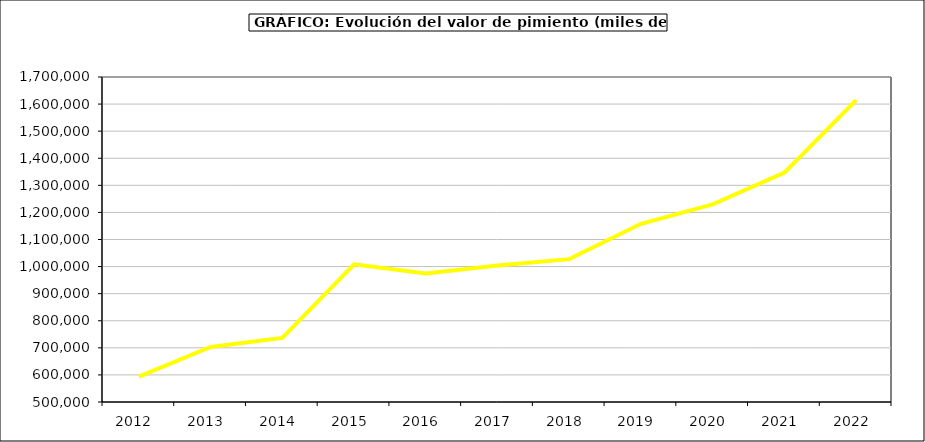
| Category | Valor |
|---|---|
| 2012.0 | 593530.063 |
| 2013.0 | 703328.169 |
| 2014.0 | 736417.986 |
| 2015.0 | 1008587 |
| 2016.0 | 974815 |
| 2017.0 | 1003610.326 |
| 2018.0 | 1027423.396 |
| 2019.0 | 1158111.218 |
| 2020.0 | 1229629.068 |
| 2021.0 | 1346944.841 |
| 2022.0 | 1614354.097 |